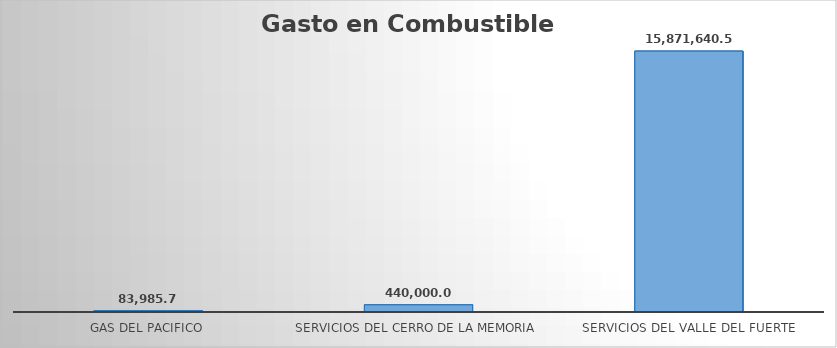
| Category | Suma  |
|---|---|
| GAS DEL PACIFICO | 83985.72 |
| SERVICIOS DEL CERRO DE LA MEMORIA  | 440000 |
| SERVICIOS DEL VALLE DEL FUERTE | 15871640.58 |